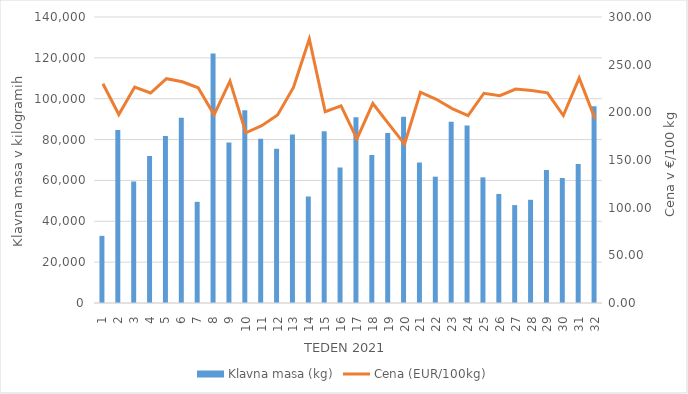
| Category | Klavna masa (kg) |
|---|---|
| 1.0 | 32871 |
| 2.0 | 84639 |
| 3.0 | 59476 |
| 4.0 | 72013 |
| 5.0 | 81759 |
| 6.0 | 90669 |
| 7.0 | 49517 |
| 8.0 | 122111 |
| 9.0 | 78545 |
| 10.0 | 94384 |
| 11.0 | 80405 |
| 12.0 | 75534 |
| 13.0 | 82440 |
| 14.0 | 52143 |
| 15.0 | 84105 |
| 16.0 | 66298 |
| 17.0 | 90925 |
| 18.0 | 72394 |
| 19.0 | 83193 |
| 20.0 | 91231 |
| 21.0 | 68763 |
| 22.0 | 61837 |
| 23.0 | 88747 |
| 24.0 | 86888 |
| 25.0 | 61507 |
| 26.0 | 53379 |
| 27.0 | 47910 |
| 28.0 | 50529 |
| 29.0 | 65062 |
| 30.0 | 61178 |
| 31.0 | 67992 |
| 32.0 | 96308 |